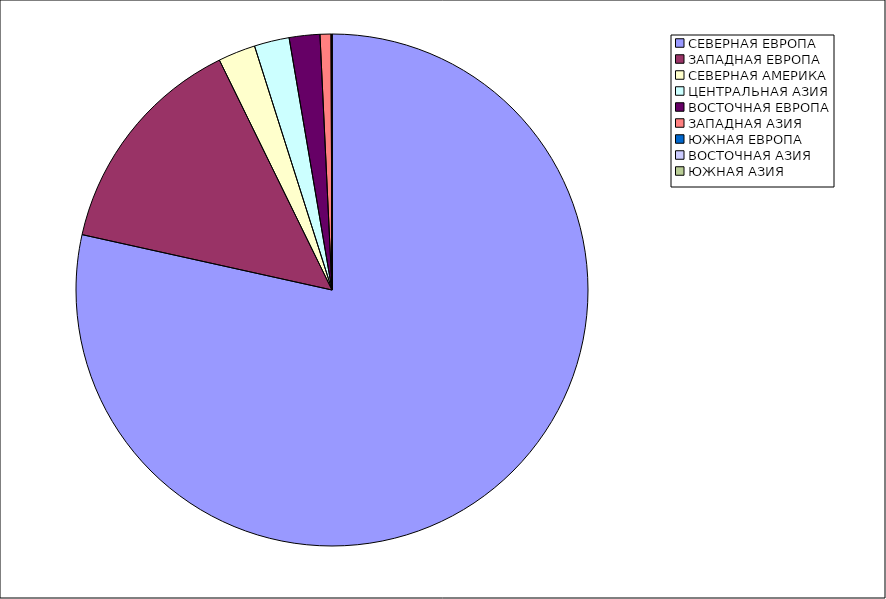
| Category | Оборот |
|---|---|
| СЕВЕРНАЯ ЕВРОПА | 78.47 |
| ЗАПАДНАЯ ЕВРОПА | 14.28 |
| СЕВЕРНАЯ АМЕРИКА | 2.356 |
| ЦЕНТРАЛЬНАЯ АЗИЯ | 2.211 |
| ВОСТОЧНАЯ ЕВРОПА | 1.933 |
| ЗАПАДНАЯ АЗИЯ | 0.688 |
| ЮЖНАЯ ЕВРОПА | 0.041 |
| ВОСТОЧНАЯ АЗИЯ | 0.021 |
| ЮЖНАЯ АЗИЯ | 0 |